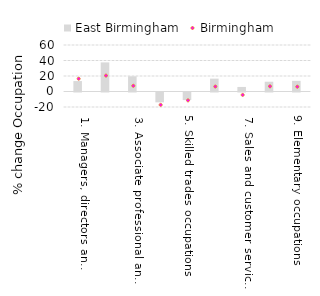
| Category | East Birmingham |
|---|---|
| 1. Managers, directors and senior officials | 13.466 |
| 2. Professional occupations | 37.537 |
| 3. Associate professional and technical occupations | 19.626 |
| 4. Administrative and secretarial occupations | -12.668 |
| 5. Skilled trades occupations | -9.757 |
| 6. Caring, leisure and other service occupations | 16.583 |
| 7. Sales and customer service occupations | 5.85 |
| 8. Process, plant and machine operatives | 12.603 |
| 9. Elementary occupations | 13.732 |